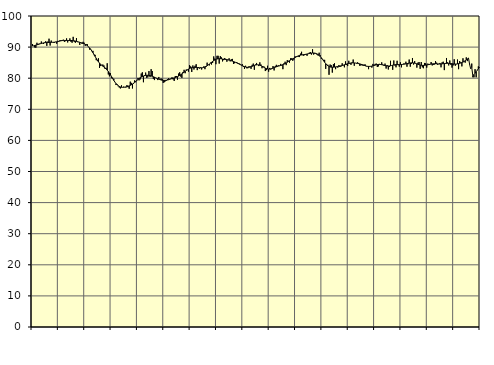
| Category | Piggar | Series 1 |
|---|---|---|
| nan | 91 | 90.35 |
| 87.0 | 90.4 | 90.41 |
| 87.0 | 89.9 | 90.53 |
| 87.0 | 89.8 | 90.63 |
| 87.0 | 91.4 | 90.74 |
| 87.0 | 90.7 | 90.84 |
| 87.0 | 91.1 | 90.96 |
| 87.0 | 91 | 91.07 |
| 87.0 | 91.8 | 91.17 |
| 87.0 | 91.2 | 91.26 |
| 87.0 | 91 | 91.34 |
| 87.0 | 91.3 | 91.41 |
| nan | 91.9 | 91.45 |
| 88.0 | 90.4 | 91.48 |
| 88.0 | 91.8 | 91.5 |
| 88.0 | 92.7 | 91.52 |
| 88.0 | 90.5 | 91.53 |
| 88.0 | 92.1 | 91.53 |
| 88.0 | 91.5 | 91.54 |
| 88.0 | 91.4 | 91.55 |
| 88.0 | 91.4 | 91.58 |
| 88.0 | 91.7 | 91.63 |
| 88.0 | 91.1 | 91.7 |
| 88.0 | 92 | 91.78 |
| nan | 91.8 | 91.87 |
| 89.0 | 92.2 | 91.96 |
| 89.0 | 92.2 | 92.04 |
| 89.0 | 92.2 | 92.09 |
| 89.0 | 92.4 | 92.13 |
| 89.0 | 91.7 | 92.14 |
| 89.0 | 91.9 | 92.14 |
| 89.0 | 92.8 | 92.13 |
| 89.0 | 91.5 | 92.12 |
| 89.0 | 92 | 92.12 |
| 89.0 | 92.8 | 92.13 |
| 89.0 | 91.7 | 92.13 |
| nan | 91.4 | 92.11 |
| 90.0 | 93.3 | 92.08 |
| 90.0 | 91.7 | 92.02 |
| 90.0 | 91.4 | 91.95 |
| 90.0 | 92.9 | 91.85 |
| 90.0 | 91.6 | 91.75 |
| 90.0 | 91.6 | 91.65 |
| 90.0 | 90.7 | 91.54 |
| 90.0 | 91.5 | 91.44 |
| 90.0 | 91.1 | 91.33 |
| 90.0 | 91.7 | 91.2 |
| 90.0 | 91.4 | 91.06 |
| nan | 90.4 | 90.89 |
| 91.0 | 90.9 | 90.67 |
| 91.0 | 90.9 | 90.41 |
| 91.0 | 90 | 90.09 |
| 91.0 | 89.2 | 89.71 |
| 91.0 | 89.4 | 89.26 |
| 91.0 | 88.7 | 88.75 |
| 91.0 | 88.8 | 88.19 |
| 91.0 | 87.4 | 87.6 |
| 91.0 | 87.5 | 86.99 |
| 91.0 | 85.8 | 86.37 |
| 91.0 | 85.6 | 85.8 |
| nan | 86.4 | 85.28 |
| 92.0 | 83.3 | 84.84 |
| 92.0 | 83.9 | 84.47 |
| 92.0 | 84.1 | 84.15 |
| 92.0 | 84.4 | 83.87 |
| 92.0 | 84.1 | 83.6 |
| 92.0 | 83 | 83.31 |
| 92.0 | 83.3 | 82.99 |
| 92.0 | 84.8 | 82.6 |
| 92.0 | 81.2 | 82.15 |
| 92.0 | 80.6 | 81.64 |
| 92.0 | 81.6 | 81.07 |
| nan | 80 | 80.47 |
| 93.0 | 80.1 | 79.86 |
| 93.0 | 79.8 | 79.28 |
| 93.0 | 78.8 | 78.76 |
| 93.0 | 77.8 | 78.29 |
| 93.0 | 78.1 | 77.91 |
| 93.0 | 77.4 | 77.6 |
| 93.0 | 77 | 77.36 |
| 93.0 | 76.7 | 77.19 |
| 93.0 | 77.7 | 77.09 |
| 93.0 | 77.1 | 77.06 |
| 93.0 | 77.3 | 77.07 |
| nan | 77.1 | 77.12 |
| 94.0 | 77 | 77.2 |
| 94.0 | 77.8 | 77.29 |
| 94.0 | 77.1 | 77.4 |
| 94.0 | 76.6 | 77.54 |
| 94.0 | 78.9 | 77.7 |
| 94.0 | 78.5 | 77.89 |
| 94.0 | 76.7 | 78.12 |
| 94.0 | 78.2 | 78.39 |
| 94.0 | 79.3 | 78.68 |
| 94.0 | 78.7 | 78.99 |
| 94.0 | 79.2 | 79.3 |
| nan | 80.1 | 79.6 |
| 95.0 | 79.3 | 79.89 |
| 95.0 | 79.6 | 80.14 |
| 95.0 | 81.5 | 80.36 |
| 95.0 | 81.9 | 80.54 |
| 95.0 | 78.7 | 80.7 |
| 95.0 | 81 | 80.81 |
| 95.0 | 81.8 | 80.9 |
| 95.0 | 80.1 | 80.95 |
| 95.0 | 80.3 | 80.95 |
| 95.0 | 82.3 | 80.91 |
| 95.0 | 80.4 | 80.84 |
| nan | 82.9 | 80.73 |
| 96.0 | 82.3 | 80.61 |
| 96.0 | 79.8 | 80.47 |
| 96.0 | 79.4 | 80.33 |
| 96.0 | 80.2 | 80.16 |
| 96.0 | 79.9 | 80 |
| 96.0 | 79.4 | 79.84 |
| 96.0 | 80.4 | 79.69 |
| 96.0 | 79.6 | 79.55 |
| 96.0 | 79.9 | 79.44 |
| 96.0 | 79.8 | 79.36 |
| 96.0 | 78.5 | 79.31 |
| nan | 78.7 | 79.3 |
| 97.0 | 79 | 79.31 |
| 97.0 | 79.2 | 79.36 |
| 97.0 | 79.7 | 79.43 |
| 97.0 | 80 | 79.52 |
| 97.0 | 79.7 | 79.63 |
| 97.0 | 79.9 | 79.76 |
| 97.0 | 80.3 | 79.88 |
| 97.0 | 79.6 | 79.99 |
| 97.0 | 79.1 | 80.1 |
| 97.0 | 80.7 | 80.21 |
| 97.0 | 80.7 | 80.34 |
| nan | 79.5 | 80.49 |
| 98.0 | 81.5 | 80.68 |
| 98.0 | 81.9 | 80.89 |
| 98.0 | 80.5 | 81.13 |
| 98.0 | 80.1 | 81.39 |
| 98.0 | 82 | 81.66 |
| 98.0 | 82.7 | 81.93 |
| 98.0 | 81.6 | 82.2 |
| 98.0 | 82.8 | 82.45 |
| 98.0 | 82.6 | 82.7 |
| 98.0 | 82.1 | 82.92 |
| 98.0 | 84.2 | 83.11 |
| nan | 83.8 | 83.27 |
| 99.0 | 82 | 83.38 |
| 99.0 | 84.1 | 83.45 |
| 99.0 | 82.8 | 83.49 |
| 99.0 | 84 | 83.49 |
| 99.0 | 84.5 | 83.48 |
| 99.0 | 82.6 | 83.44 |
| 99.0 | 83.6 | 83.39 |
| 99.0 | 83.1 | 83.35 |
| 99.0 | 83.5 | 83.34 |
| 99.0 | 82.8 | 83.35 |
| 99.0 | 83.4 | 83.4 |
| nan | 83.8 | 83.48 |
| 0.0 | 82.9 | 83.62 |
| 0.0 | 83.6 | 83.79 |
| 0.0 | 85 | 84.01 |
| 0.0 | 84.3 | 84.27 |
| 0.0 | 84.1 | 84.54 |
| 0.0 | 85 | 84.82 |
| 0.0 | 84.4 | 85.11 |
| 0.0 | 84.9 | 85.39 |
| 0.0 | 87 | 85.64 |
| 0.0 | 86.3 | 85.87 |
| 0.0 | 84.5 | 86.05 |
| nan | 87.2 | 86.18 |
| 1.0 | 87.2 | 86.25 |
| 1.0 | 84.7 | 86.28 |
| 1.0 | 87.1 | 86.27 |
| 1.0 | 86.7 | 86.22 |
| 1.0 | 85.4 | 86.16 |
| 1.0 | 85.8 | 86.11 |
| 1.0 | 86.5 | 86.06 |
| 1.0 | 86.2 | 86.02 |
| 1.0 | 85.3 | 85.96 |
| 1.0 | 85.9 | 85.9 |
| 1.0 | 86.4 | 85.82 |
| nan | 85.4 | 85.74 |
| 2.0 | 86.1 | 85.62 |
| 2.0 | 86.2 | 85.5 |
| 2.0 | 84.6 | 85.37 |
| 2.0 | 84.8 | 85.23 |
| 2.0 | 85.1 | 85.08 |
| 2.0 | 85.2 | 84.93 |
| 2.0 | 84.6 | 84.76 |
| 2.0 | 84.8 | 84.59 |
| 2.0 | 84.6 | 84.41 |
| 2.0 | 84.2 | 84.22 |
| 2.0 | 84.5 | 84.04 |
| nan | 83.6 | 83.87 |
| 3.0 | 83 | 83.72 |
| 3.0 | 84 | 83.6 |
| 3.0 | 83.2 | 83.53 |
| 3.0 | 83.2 | 83.5 |
| 3.0 | 83.8 | 83.52 |
| 3.0 | 83.8 | 83.59 |
| 3.0 | 83 | 83.69 |
| 3.0 | 84.3 | 83.82 |
| 3.0 | 84.7 | 83.96 |
| 3.0 | 82.7 | 84.1 |
| 3.0 | 84.4 | 84.22 |
| nan | 84.9 | 84.29 |
| 4.0 | 84.3 | 84.32 |
| 4.0 | 83.9 | 84.28 |
| 4.0 | 85.1 | 84.19 |
| 4.0 | 84.4 | 84.04 |
| 4.0 | 83.2 | 83.86 |
| 4.0 | 83.8 | 83.65 |
| 4.0 | 83.7 | 83.44 |
| 4.0 | 82.3 | 83.25 |
| 4.0 | 82.6 | 83.08 |
| 4.0 | 84 | 82.97 |
| 4.0 | 82.1 | 82.92 |
| nan | 83.3 | 82.93 |
| 5.0 | 82.8 | 82.99 |
| 5.0 | 83 | 83.11 |
| 5.0 | 83.9 | 83.25 |
| 5.0 | 82.5 | 83.39 |
| 5.0 | 83.9 | 83.54 |
| 5.0 | 84.3 | 83.67 |
| 5.0 | 84 | 83.79 |
| 5.0 | 84.1 | 83.9 |
| 5.0 | 83.9 | 84 |
| 5.0 | 84.6 | 84.1 |
| 5.0 | 84.1 | 84.22 |
| nan | 82.9 | 84.36 |
| 6.0 | 84.8 | 84.52 |
| 6.0 | 85.3 | 84.7 |
| 6.0 | 84.2 | 84.91 |
| 6.0 | 85.8 | 85.13 |
| 6.0 | 85.6 | 85.38 |
| 6.0 | 85 | 85.61 |
| 6.0 | 86.4 | 85.83 |
| 6.0 | 86.4 | 86.04 |
| 6.0 | 85.6 | 86.24 |
| 6.0 | 86 | 86.44 |
| 6.0 | 87 | 86.63 |
| nan | 87 | 86.83 |
| 7.0 | 87.1 | 87.01 |
| 7.0 | 86.9 | 87.17 |
| 7.0 | 86.8 | 87.31 |
| 7.0 | 87.9 | 87.41 |
| 7.0 | 88.5 | 87.48 |
| 7.0 | 87.4 | 87.54 |
| 7.0 | 87.2 | 87.59 |
| 7.0 | 87.5 | 87.64 |
| 7.0 | 87.6 | 87.7 |
| 7.0 | 87.2 | 87.78 |
| 7.0 | 87.8 | 87.85 |
| nan | 88.2 | 87.93 |
| 8.0 | 88.4 | 88 |
| 8.0 | 87.6 | 88.07 |
| 8.0 | 89.3 | 88.11 |
| 8.0 | 87.6 | 88.11 |
| 8.0 | 87.9 | 88.07 |
| 8.0 | 88.1 | 87.98 |
| 8.0 | 87.6 | 87.82 |
| 8.0 | 87.3 | 87.61 |
| 8.0 | 88.2 | 87.32 |
| 8.0 | 87.4 | 86.97 |
| 8.0 | 86.2 | 86.56 |
| nan | 86.2 | 86.1 |
| 9.0 | 85.9 | 85.61 |
| 9.0 | 85.9 | 85.13 |
| 9.0 | 83 | 84.68 |
| 9.0 | 84.4 | 84.29 |
| 9.0 | 84.3 | 83.98 |
| 9.0 | 81.1 | 83.76 |
| 9.0 | 84.4 | 83.62 |
| 9.0 | 84.2 | 83.54 |
| 9.0 | 81.8 | 83.53 |
| 9.0 | 84.5 | 83.54 |
| 9.0 | 84.8 | 83.58 |
| nan | 82.9 | 83.63 |
| 10.0 | 83.6 | 83.69 |
| 10.0 | 83.4 | 83.75 |
| 10.0 | 84.2 | 83.82 |
| 10.0 | 83.6 | 83.9 |
| 10.0 | 83.8 | 83.99 |
| 10.0 | 84.8 | 84.09 |
| 10.0 | 84.1 | 84.2 |
| 10.0 | 83.5 | 84.32 |
| 10.0 | 85.4 | 84.44 |
| 10.0 | 84.3 | 84.56 |
| 10.0 | 83.9 | 84.66 |
| nan | 85.6 | 84.75 |
| 11.0 | 84.7 | 84.82 |
| 11.0 | 84.3 | 84.88 |
| 11.0 | 85.1 | 84.92 |
| 11.0 | 86 | 84.93 |
| 11.0 | 84 | 84.91 |
| 11.0 | 84.9 | 84.88 |
| 11.0 | 84.7 | 84.82 |
| 11.0 | 85.1 | 84.76 |
| 11.0 | 84.9 | 84.69 |
| 11.0 | 84 | 84.6 |
| 11.0 | 84.1 | 84.5 |
| nan | 84.2 | 84.38 |
| 12.0 | 84 | 84.25 |
| 12.0 | 84.4 | 84.12 |
| 12.0 | 84.4 | 83.99 |
| 12.0 | 83.8 | 83.89 |
| 12.0 | 83.9 | 83.82 |
| 12.0 | 82.9 | 83.79 |
| 12.0 | 83.9 | 83.8 |
| 12.0 | 83.8 | 83.83 |
| 12.0 | 83.4 | 83.89 |
| 12.0 | 84.6 | 83.98 |
| 12.0 | 84.2 | 84.09 |
| nan | 84.6 | 84.2 |
| 13.0 | 84.7 | 84.3 |
| 13.0 | 83.6 | 84.39 |
| 13.0 | 83.8 | 84.43 |
| 13.0 | 84.6 | 84.43 |
| 13.0 | 84.5 | 84.4 |
| 13.0 | 85.1 | 84.34 |
| 13.0 | 84.4 | 84.25 |
| 13.0 | 84 | 84.17 |
| 13.0 | 84.7 | 84.08 |
| 13.0 | 83.1 | 84 |
| 13.0 | 84.2 | 83.95 |
| nan | 82.8 | 83.93 |
| 14.0 | 83.6 | 83.94 |
| 14.0 | 85.6 | 84 |
| 14.0 | 84.1 | 84.08 |
| 14.0 | 82.7 | 84.17 |
| 14.0 | 85.7 | 84.25 |
| 14.0 | 84.1 | 84.31 |
| 14.0 | 83.5 | 84.35 |
| 14.0 | 85.6 | 84.37 |
| 14.0 | 84.2 | 84.38 |
| 14.0 | 83.7 | 84.38 |
| 14.0 | 85.1 | 84.39 |
| nan | 83.5 | 84.41 |
| 15.0 | 84.5 | 84.44 |
| 15.0 | 84.7 | 84.48 |
| 15.0 | 84.7 | 84.53 |
| 15.0 | 85.3 | 84.61 |
| 15.0 | 83.7 | 84.69 |
| 15.0 | 84.5 | 84.78 |
| 15.0 | 86 | 84.85 |
| 15.0 | 83.7 | 84.9 |
| 15.0 | 84.6 | 84.94 |
| 15.0 | 86.5 | 84.94 |
| 15.0 | 84.4 | 84.9 |
| nan | 85.5 | 84.83 |
| 16.0 | 84.7 | 84.73 |
| 16.0 | 83.4 | 84.61 |
| 16.0 | 85 | 84.48 |
| 16.0 | 85.2 | 84.35 |
| 16.0 | 83 | 84.23 |
| 16.0 | 85.2 | 84.16 |
| 16.0 | 83.5 | 84.12 |
| 16.0 | 83.2 | 84.12 |
| 16.0 | 84.9 | 84.15 |
| 16.0 | 84.8 | 84.2 |
| 16.0 | 83.4 | 84.26 |
| nan | 84.7 | 84.33 |
| 17.0 | 84.3 | 84.4 |
| 17.0 | 84.5 | 84.48 |
| 17.0 | 85.2 | 84.55 |
| 17.0 | 84.1 | 84.6 |
| 17.0 | 84.3 | 84.64 |
| 17.0 | 84.4 | 84.66 |
| 17.0 | 85.5 | 84.65 |
| 17.0 | 85 | 84.63 |
| 17.0 | 84.3 | 84.6 |
| 17.0 | 84.6 | 84.57 |
| 17.0 | 84.9 | 84.56 |
| nan | 83.5 | 84.58 |
| 18.0 | 85.1 | 84.62 |
| 18.0 | 85.3 | 84.66 |
| 18.0 | 82.6 | 84.71 |
| 18.0 | 84.9 | 84.74 |
| 18.0 | 86.5 | 84.77 |
| 18.0 | 85.1 | 84.78 |
| 18.0 | 84.1 | 84.77 |
| 18.0 | 85.7 | 84.74 |
| 18.0 | 84.3 | 84.69 |
| 18.0 | 83.4 | 84.64 |
| 18.0 | 84.1 | 84.59 |
| nan | 86.1 | 84.56 |
| 19.0 | 84 | 84.55 |
| 19.0 | 84.5 | 84.57 |
| 19.0 | 86 | 84.62 |
| 19.0 | 82.9 | 84.7 |
| 19.0 | 85.5 | 84.79 |
| 19.0 | 85.1 | 84.89 |
| 19.0 | 83.8 | 85.02 |
| 19.0 | 86.4 | 85.18 |
| 19.0 | 85.3 | 85.37 |
| 19.0 | 85 | 85.62 |
| 19.0 | 86.7 | 85.9 |
| nan | 85.5 | 86.19 |
| 20.0 | 86.5 | 86.5 |
| 20.0 | 84.4 | 84.53 |
| 20.0 | 83 | 83.05 |
| 20.0 | 84.7 | 83.42 |
| 20.0 | 80.3 | 80.75 |
| 20.0 | 80.3 | 81.18 |
| 20.0 | 82.9 | 81.63 |
| 20.0 | 80.3 | 82.09 |
| 20.0 | 82.7 | 82.55 |
| 20.0 | 83.8 | 83 |
| 20.0 | 83.6 | 83.45 |